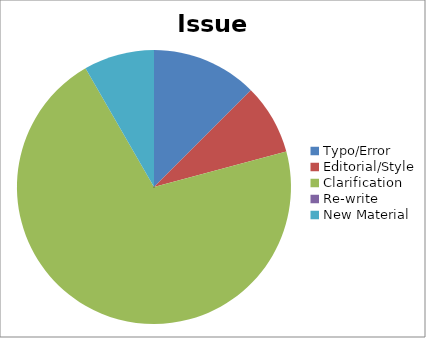
| Category | Issue Type |
|---|---|
| Typo/Error | 3 |
| Editorial/Style | 2 |
| Clarification | 17 |
| Re-write | 0 |
| New Material | 2 |